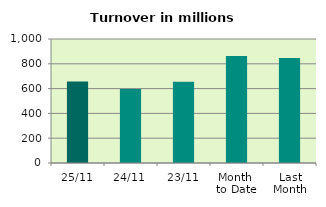
| Category | Series 0 |
|---|---|
| 25/11 | 656.271 |
| 24/11 | 597.578 |
| 23/11 | 656.004 |
| Month 
to Date | 862.752 |
| Last
Month | 847.422 |